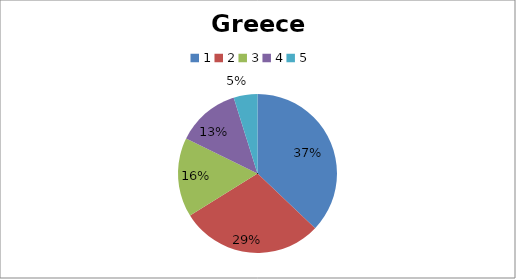
| Category | Greece |
|---|---|
| 0 | 23 |
| 1 | 18 |
| 2 | 10 |
| 3 | 8 |
| 4 | 3 |